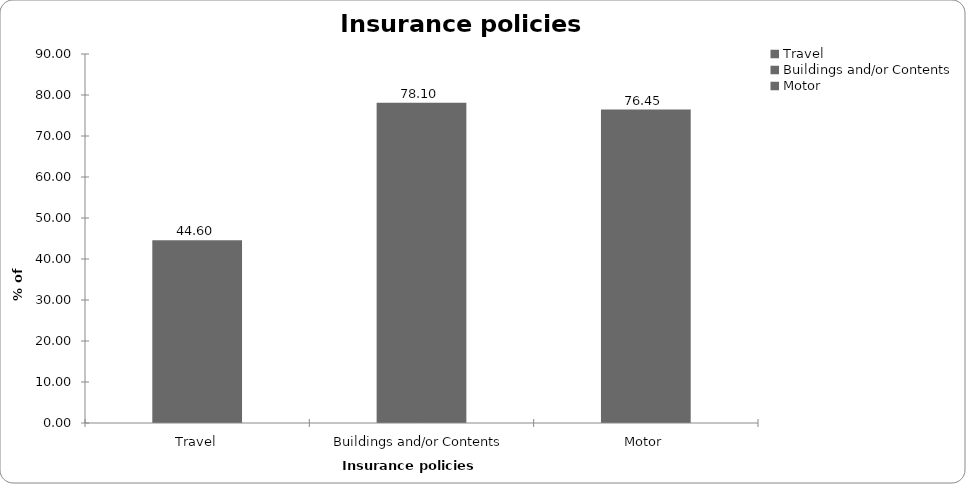
| Category | Insurance policies held |
|---|---|
| Travel | 44.6 |
| Buildings and/or Contents | 78.1 |
| Motor | 76.447 |